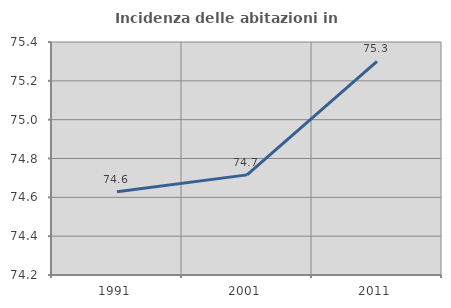
| Category | Incidenza delle abitazioni in proprietà  |
|---|---|
| 1991.0 | 74.629 |
| 2001.0 | 74.716 |
| 2011.0 | 75.3 |